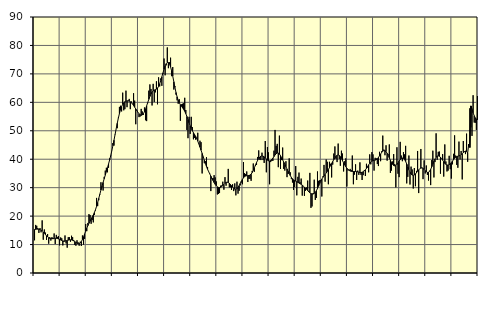
| Category | Piggar | Series 1 |
|---|---|---|
| nan | 11.5 | 15.32 |
| 87.0 | 16.9 | 15.34 |
| 87.0 | 16.6 | 15.43 |
| 87.0 | 15.8 | 15.41 |
| 87.0 | 14.1 | 15.37 |
| 87.0 | 15.8 | 15.27 |
| 87.0 | 14.3 | 15.09 |
| 87.0 | 18.5 | 14.82 |
| 87.0 | 11.7 | 14.44 |
| 87.0 | 15.3 | 14 |
| 87.0 | 14.2 | 13.52 |
| 87.0 | 11.6 | 13.07 |
| nan | 13.7 | 12.68 |
| 88.0 | 10.3 | 12.4 |
| 88.0 | 12.6 | 12.2 |
| 88.0 | 11.4 | 12.1 |
| 88.0 | 12.6 | 12.09 |
| 88.0 | 11.9 | 12.13 |
| 88.0 | 13.9 | 12.18 |
| 88.0 | 10.2 | 12.21 |
| 88.0 | 13.4 | 12.19 |
| 88.0 | 12.7 | 12.12 |
| 88.0 | 13 | 11.98 |
| 88.0 | 9.7 | 11.8 |
| nan | 12.5 | 11.6 |
| 89.0 | 12.2 | 11.41 |
| 89.0 | 9.7 | 11.28 |
| 89.0 | 10.9 | 11.22 |
| 89.0 | 13.2 | 11.24 |
| 89.0 | 10.4 | 11.32 |
| 89.0 | 8.9 | 11.44 |
| 89.0 | 12.6 | 11.55 |
| 89.0 | 12.6 | 11.65 |
| 89.0 | 11 | 11.67 |
| 89.0 | 13.1 | 11.62 |
| 89.0 | 12.6 | 11.49 |
| nan | 11.6 | 11.29 |
| 90.0 | 9.9 | 11.02 |
| 90.0 | 9.6 | 10.74 |
| 90.0 | 11.5 | 10.49 |
| 90.0 | 10.8 | 10.32 |
| 90.0 | 9.6 | 10.31 |
| 90.0 | 11 | 10.54 |
| 90.0 | 9.5 | 11.04 |
| 90.0 | 13.2 | 11.77 |
| 90.0 | 10 | 12.68 |
| 90.0 | 12 | 13.69 |
| 90.0 | 17.2 | 14.71 |
| nan | 14.7 | 15.71 |
| 91.0 | 17.6 | 16.64 |
| 91.0 | 20.7 | 17.47 |
| 91.0 | 20.4 | 18.22 |
| 91.0 | 17.3 | 18.92 |
| 91.0 | 18.6 | 19.63 |
| 91.0 | 17.8 | 20.39 |
| 91.0 | 20.4 | 21.25 |
| 91.0 | 22 | 22.26 |
| 91.0 | 26.4 | 23.44 |
| 91.0 | 23.5 | 24.78 |
| 91.0 | 25.6 | 26.22 |
| nan | 27.5 | 27.69 |
| 92.0 | 31.9 | 29.14 |
| 92.0 | 30.3 | 30.53 |
| 92.0 | 29 | 31.85 |
| 92.0 | 33.8 | 33.12 |
| 92.0 | 36 | 34.38 |
| 92.0 | 37 | 35.66 |
| 92.0 | 35.4 | 36.97 |
| 92.0 | 37 | 38.32 |
| 92.0 | 40.3 | 39.75 |
| 92.0 | 41.1 | 41.27 |
| 92.0 | 42.9 | 42.94 |
| nan | 45.7 | 44.76 |
| 93.0 | 44.8 | 46.68 |
| 93.0 | 48.8 | 48.67 |
| 93.0 | 50.7 | 50.68 |
| 93.0 | 50.9 | 52.63 |
| 93.0 | 54.6 | 54.44 |
| 93.0 | 58.4 | 56.05 |
| 93.0 | 58.8 | 57.42 |
| 93.0 | 56.8 | 58.51 |
| 93.0 | 63.4 | 59.3 |
| 93.0 | 57.2 | 59.85 |
| 93.0 | 57.6 | 60.21 |
| nan | 64.1 | 60.41 |
| 94.0 | 58.3 | 60.5 |
| 94.0 | 60.7 | 60.5 |
| 94.0 | 61.2 | 60.4 |
| 94.0 | 57.6 | 60.19 |
| 94.0 | 60.3 | 59.86 |
| 94.0 | 59.5 | 59.41 |
| 94.0 | 63.2 | 58.87 |
| 94.0 | 60.6 | 58.29 |
| 94.0 | 52.3 | 57.7 |
| 94.0 | 57.3 | 57.11 |
| 94.0 | 56.6 | 56.53 |
| nan | 54.8 | 56.01 |
| 95.0 | 55 | 55.62 |
| 95.0 | 57.7 | 55.43 |
| 95.0 | 56.8 | 55.54 |
| 95.0 | 55.6 | 55.97 |
| 95.0 | 58.2 | 56.69 |
| 95.0 | 53.7 | 57.66 |
| 95.0 | 53.4 | 58.77 |
| 95.0 | 59.7 | 59.91 |
| 95.0 | 64.1 | 61.04 |
| 95.0 | 66.3 | 62.08 |
| 95.0 | 64.7 | 62.94 |
| nan | 58.9 | 63.59 |
| 96.0 | 66.5 | 64.02 |
| 96.0 | 60.1 | 64.3 |
| 96.0 | 63.5 | 64.46 |
| 96.0 | 67.4 | 64.65 |
| 96.0 | 59.3 | 65 |
| 96.0 | 68.8 | 65.59 |
| 96.0 | 65.6 | 66.5 |
| 96.0 | 68.4 | 67.66 |
| 96.0 | 65.8 | 68.98 |
| 96.0 | 70 | 70.35 |
| 96.0 | 75.4 | 71.65 |
| nan | 69.5 | 72.77 |
| 97.0 | 73 | 73.59 |
| 97.0 | 79.3 | 74.01 |
| 97.0 | 72 | 73.99 |
| 97.0 | 74.1 | 73.48 |
| 97.0 | 75.7 | 72.47 |
| 97.0 | 69.2 | 71.03 |
| 97.0 | 72.4 | 69.23 |
| 97.0 | 64.5 | 67.24 |
| 97.0 | 65.7 | 65.25 |
| 97.0 | 62.7 | 63.45 |
| 97.0 | 60.7 | 61.94 |
| nan | 59.5 | 60.75 |
| 98.0 | 61.1 | 59.86 |
| 98.0 | 53.5 | 59.18 |
| 98.0 | 59.3 | 58.61 |
| 98.0 | 59.5 | 58.09 |
| 98.0 | 59.7 | 57.53 |
| 98.0 | 61.6 | 56.86 |
| 98.0 | 57.3 | 56.03 |
| 98.0 | 50.3 | 55.04 |
| 98.0 | 47.4 | 53.95 |
| 98.0 | 54.9 | 52.81 |
| 98.0 | 48.9 | 51.74 |
| nan | 54.9 | 50.8 |
| 99.0 | 51.3 | 50.01 |
| 99.0 | 47 | 49.35 |
| 99.0 | 47.5 | 48.73 |
| 99.0 | 46.9 | 48.06 |
| 99.0 | 47.5 | 47.27 |
| 99.0 | 49.3 | 46.35 |
| 99.0 | 45.4 | 45.33 |
| 99.0 | 46.5 | 44.26 |
| 99.0 | 46 | 43.17 |
| 99.0 | 35 | 42.05 |
| 99.0 | 40.6 | 40.86 |
| nan | 38.6 | 39.66 |
| 0.0 | 39.3 | 38.48 |
| 0.0 | 40.7 | 37.4 |
| 0.0 | 37.3 | 36.46 |
| 0.0 | 35.7 | 35.62 |
| 0.0 | 35 | 34.85 |
| 0.0 | 28.8 | 34.08 |
| 0.0 | 33 | 33.3 |
| 0.0 | 33.4 | 32.53 |
| 0.0 | 34.4 | 31.81 |
| 0.0 | 33.6 | 31.18 |
| 0.0 | 32.2 | 30.68 |
| nan | 27.6 | 30.31 |
| 1.0 | 27.8 | 30.09 |
| 1.0 | 28.1 | 30.04 |
| 1.0 | 30.7 | 30.14 |
| 1.0 | 30.8 | 30.39 |
| 1.0 | 32.1 | 30.75 |
| 1.0 | 29.3 | 31.17 |
| 1.0 | 33.7 | 31.57 |
| 1.0 | 30.7 | 31.84 |
| 1.0 | 32 | 31.93 |
| 1.0 | 36.6 | 31.82 |
| 1.0 | 30.1 | 31.54 |
| nan | 30.1 | 31.14 |
| 2.0 | 29.2 | 30.68 |
| 2.0 | 31.2 | 30.2 |
| 2.0 | 28.8 | 29.78 |
| 2.0 | 31.5 | 29.5 |
| 2.0 | 27.3 | 29.43 |
| 2.0 | 32.1 | 29.61 |
| 2.0 | 27.9 | 30.06 |
| 2.0 | 28.9 | 30.71 |
| 2.0 | 30.8 | 31.47 |
| 2.0 | 31.8 | 32.23 |
| 2.0 | 31.2 | 32.9 |
| nan | 39 | 33.46 |
| 3.0 | 35.1 | 33.86 |
| 3.0 | 34.8 | 34.1 |
| 3.0 | 35.7 | 34.2 |
| 3.0 | 32 | 34.22 |
| 3.0 | 33.1 | 34.26 |
| 3.0 | 33.1 | 34.41 |
| 3.0 | 32.4 | 34.74 |
| 3.0 | 35.9 | 35.31 |
| 3.0 | 38.5 | 36.07 |
| 3.0 | 35.6 | 36.98 |
| 3.0 | 37.7 | 37.94 |
| nan | 38 | 38.83 |
| 4.0 | 40.8 | 39.62 |
| 4.0 | 43.1 | 40.28 |
| 4.0 | 39.8 | 40.78 |
| 4.0 | 39.7 | 41.08 |
| 4.0 | 42.3 | 41.18 |
| 4.0 | 39.7 | 41.09 |
| 4.0 | 38.7 | 40.84 |
| 4.0 | 46.4 | 40.46 |
| 4.0 | 35.4 | 40.05 |
| 4.0 | 44.3 | 39.67 |
| 4.0 | 42.4 | 39.44 |
| nan | 31.2 | 39.41 |
| 5.0 | 39 | 39.56 |
| 5.0 | 39.4 | 39.88 |
| 5.0 | 39.4 | 40.36 |
| 5.0 | 43 | 40.92 |
| 5.0 | 50.3 | 41.48 |
| 5.0 | 44.7 | 41.94 |
| 5.0 | 45.4 | 42.2 |
| 5.0 | 37.2 | 42.16 |
| 5.0 | 48.3 | 41.83 |
| 5.0 | 36.6 | 41.27 |
| 5.0 | 39.7 | 40.55 |
| nan | 44.1 | 39.77 |
| 6.0 | 36.6 | 38.97 |
| 6.0 | 36 | 38.17 |
| 6.0 | 39.3 | 37.37 |
| 6.0 | 33.7 | 36.57 |
| 6.0 | 34.8 | 35.76 |
| 6.0 | 40.3 | 34.98 |
| 6.0 | 35.4 | 34.25 |
| 6.0 | 33 | 33.62 |
| 6.0 | 31.8 | 33.13 |
| 6.0 | 29.2 | 32.77 |
| 6.0 | 30.2 | 32.52 |
| nan | 37.6 | 32.3 |
| 7.0 | 27.3 | 32.09 |
| 7.0 | 33.8 | 31.87 |
| 7.0 | 35.3 | 31.63 |
| 7.0 | 31.9 | 31.4 |
| 7.0 | 33.2 | 31.17 |
| 7.0 | 27.2 | 30.89 |
| 7.0 | 30.5 | 30.56 |
| 7.0 | 27.1 | 30.22 |
| 7.0 | 28.9 | 29.83 |
| 7.0 | 30.1 | 29.42 |
| 7.0 | 32.5 | 28.98 |
| nan | 28.9 | 28.53 |
| 8.0 | 35.2 | 28.16 |
| 8.0 | 22.9 | 27.91 |
| 8.0 | 23.4 | 27.77 |
| 8.0 | 28.1 | 27.77 |
| 8.0 | 32.8 | 27.97 |
| 8.0 | 25.7 | 28.36 |
| 8.0 | 26.4 | 28.95 |
| 8.0 | 35.7 | 29.7 |
| 8.0 | 32.4 | 30.55 |
| 8.0 | 32.6 | 31.44 |
| 8.0 | 32.7 | 32.29 |
| nan | 26.9 | 33.03 |
| 9.0 | 34 | 33.64 |
| 9.0 | 38 | 34.14 |
| 9.0 | 32.1 | 34.65 |
| 9.0 | 39.9 | 35.17 |
| 9.0 | 39.1 | 35.73 |
| 9.0 | 31.2 | 36.37 |
| 9.0 | 39.1 | 37.07 |
| 9.0 | 38.4 | 37.8 |
| 9.0 | 33.6 | 38.51 |
| 9.0 | 38.1 | 39.21 |
| 9.0 | 42 | 39.87 |
| nan | 44.5 | 40.5 |
| 10.0 | 40.1 | 41.03 |
| 10.0 | 39 | 41.38 |
| 10.0 | 45.5 | 41.49 |
| 10.0 | 40.1 | 41.34 |
| 10.0 | 37.7 | 40.9 |
| 10.0 | 43 | 40.25 |
| 10.0 | 42 | 39.5 |
| 10.0 | 35.7 | 38.71 |
| 10.0 | 39.3 | 37.99 |
| 10.0 | 40.3 | 37.37 |
| 10.0 | 30.4 | 36.86 |
| nan | 36.1 | 36.43 |
| 11.0 | 36 | 36.09 |
| 11.0 | 36.6 | 35.86 |
| 11.0 | 36.2 | 35.74 |
| 11.0 | 41.3 | 35.69 |
| 11.0 | 31.2 | 35.69 |
| 11.0 | 34.6 | 35.7 |
| 11.0 | 38.2 | 35.67 |
| 11.0 | 32.7 | 35.61 |
| 11.0 | 36 | 35.53 |
| 11.0 | 34.5 | 35.43 |
| 11.0 | 38.9 | 35.35 |
| nan | 34.5 | 35.33 |
| 12.0 | 32.7 | 35.4 |
| 12.0 | 34.4 | 35.58 |
| 12.0 | 36.1 | 35.87 |
| 12.0 | 34.1 | 36.27 |
| 12.0 | 38.4 | 36.79 |
| 12.0 | 37.1 | 37.4 |
| 12.0 | 35.4 | 38.02 |
| 12.0 | 41.7 | 38.59 |
| 12.0 | 38.2 | 39.04 |
| 12.0 | 42.5 | 39.33 |
| 12.0 | 41.7 | 39.5 |
| nan | 36 | 39.57 |
| 13.0 | 40.5 | 39.67 |
| 13.0 | 40.3 | 39.87 |
| 13.0 | 38.3 | 40.17 |
| 13.0 | 37.6 | 40.62 |
| 13.0 | 42.6 | 41.19 |
| 13.0 | 39.3 | 41.82 |
| 13.0 | 42.8 | 42.41 |
| 13.0 | 48.3 | 42.84 |
| 13.0 | 43.4 | 43.06 |
| 13.0 | 41.4 | 43 |
| 13.0 | 44.9 | 42.66 |
| nan | 39.5 | 42.1 |
| 14.0 | 41.7 | 41.37 |
| 14.0 | 45.2 | 40.5 |
| 14.0 | 35.2 | 39.62 |
| 14.0 | 36 | 38.83 |
| 14.0 | 39.2 | 38.21 |
| 14.0 | 41.8 | 37.78 |
| 14.0 | 38.3 | 37.64 |
| 14.0 | 30.1 | 37.78 |
| 14.0 | 44.2 | 38.15 |
| 14.0 | 34.9 | 38.7 |
| 14.0 | 33.7 | 39.31 |
| nan | 46.1 | 39.86 |
| 15.0 | 41.3 | 40.26 |
| 15.0 | 39.3 | 40.42 |
| 15.0 | 42.5 | 40.3 |
| 15.0 | 41.7 | 39.92 |
| 15.0 | 44.7 | 39.24 |
| 15.0 | 31.5 | 38.33 |
| 15.0 | 33.8 | 37.32 |
| 15.0 | 41.3 | 36.32 |
| 15.0 | 31.1 | 35.45 |
| 15.0 | 37.4 | 34.79 |
| 15.0 | 36.4 | 34.42 |
| nan | 29.7 | 34.34 |
| 16.0 | 36.9 | 34.48 |
| 16.0 | 30.5 | 34.81 |
| 16.0 | 35.9 | 35.28 |
| 16.0 | 42.9 | 35.79 |
| 16.0 | 28.1 | 36.27 |
| 16.0 | 36.7 | 36.66 |
| 16.0 | 43.6 | 36.89 |
| 16.0 | 37.1 | 36.91 |
| 16.0 | 33 | 36.74 |
| 16.0 | 39.6 | 36.4 |
| 16.0 | 35 | 35.97 |
| nan | 37.8 | 35.58 |
| 17.0 | 34.5 | 35.36 |
| 17.0 | 32.5 | 35.41 |
| 17.0 | 35.9 | 35.79 |
| 17.0 | 30.9 | 36.43 |
| 17.0 | 39.7 | 37.31 |
| 17.0 | 43 | 38.32 |
| 17.0 | 33.6 | 39.28 |
| 17.0 | 39 | 40.1 |
| 17.0 | 49.1 | 40.73 |
| 17.0 | 39.8 | 41.1 |
| 17.0 | 42.6 | 41.18 |
| nan | 42.7 | 41.03 |
| 18.0 | 34.9 | 40.7 |
| 18.0 | 40.2 | 40.24 |
| 18.0 | 41.8 | 39.68 |
| 18.0 | 33.9 | 39.08 |
| 18.0 | 45.2 | 38.55 |
| 18.0 | 39.2 | 38.16 |
| 18.0 | 35.7 | 37.95 |
| 18.0 | 36 | 37.94 |
| 18.0 | 41.2 | 38.08 |
| 18.0 | 36.5 | 38.38 |
| 18.0 | 33.2 | 38.81 |
| nan | 38.2 | 39.31 |
| 19.0 | 41.9 | 39.82 |
| 19.0 | 48.4 | 40.29 |
| 19.0 | 41.3 | 40.65 |
| 19.0 | 38 | 40.93 |
| 19.0 | 37 | 41.08 |
| 19.0 | 46.2 | 41.16 |
| 19.0 | 39.9 | 41.33 |
| 19.0 | 42.9 | 41.6 |
| 19.0 | 32.9 | 41.95 |
| 19.0 | 46.4 | 42.33 |
| 19.0 | 42.5 | 42.68 |
| nan | 41.8 | 42.86 |
| 20.0 | 49 | 42.71 |
| 20.0 | 39.1 | 42.2 |
| 20.0 | 44.6 | 45.25 |
| 20.0 | 57.9 | 44.16 |
| 20.0 | 51.2 | 58.74 |
| 20.0 | 48.2 | 57.5 |
| 20.0 | 62.5 | 56.31 |
| 20.0 | 52.9 | 55.31 |
| 20.0 | 52.8 | 54.56 |
| 20.0 | 50.3 | 54.09 |
| 20.0 | 62.2 | 53.85 |